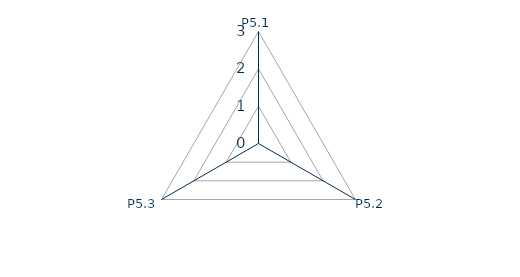
| Category | Series 0 |
|---|---|
| P5.1 | 0 |
| P5.2 | 0 |
| P5.3 | 0 |